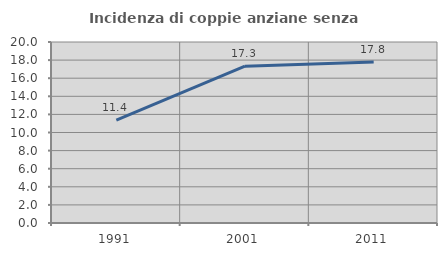
| Category | Incidenza di coppie anziane senza figli  |
|---|---|
| 1991.0 | 11.364 |
| 2001.0 | 17.333 |
| 2011.0 | 17.797 |